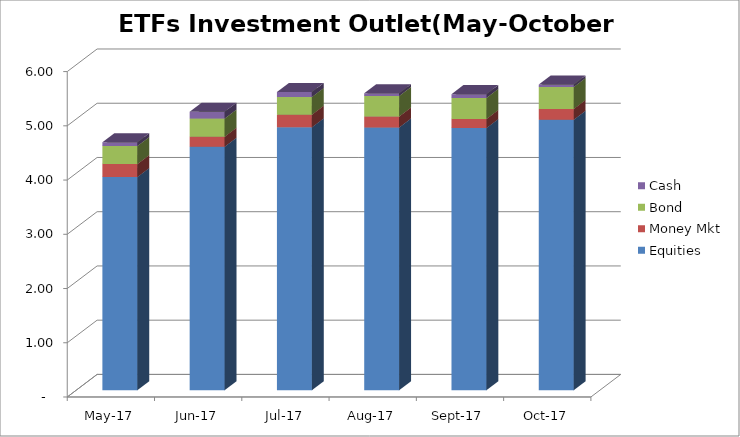
| Category | Equities | Money Mkt | Bond | Cash |
|---|---|---|---|---|
| 2017-05-01 | 3929640236.88 | 239721186.16 | 332508830.38 | 69359211.51 |
| 2017-06-01 | 4489263535.21 | 184470666.46 | 334603871.69 | 127093688.75 |
| 2017-07-01 | 4847218252.2 | 232984667.32 | 326329620.6 | 91679437.13 |
| 2017-08-01 | 4844657255.17 | 201591154.97 | 379243242.93 | 51169062.96 |
| 2017-09-01 | 4833111967.72 | 168172766.71 | 388932938.58 | 68776258.51 |
| 2017-10-01 | 4987236106.21 | 199138352.45 | 403914182.01 | 44490229.24 |